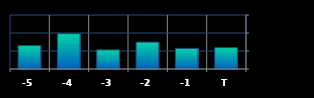
| Category | Series 0 |
|---|---|
| T | 2378567 |
| -1 | 2289363 |
| -2 | 2985859 |
| -3 | 2125441 |
| -4 | 3923738 |
| -5 | 2596510 |